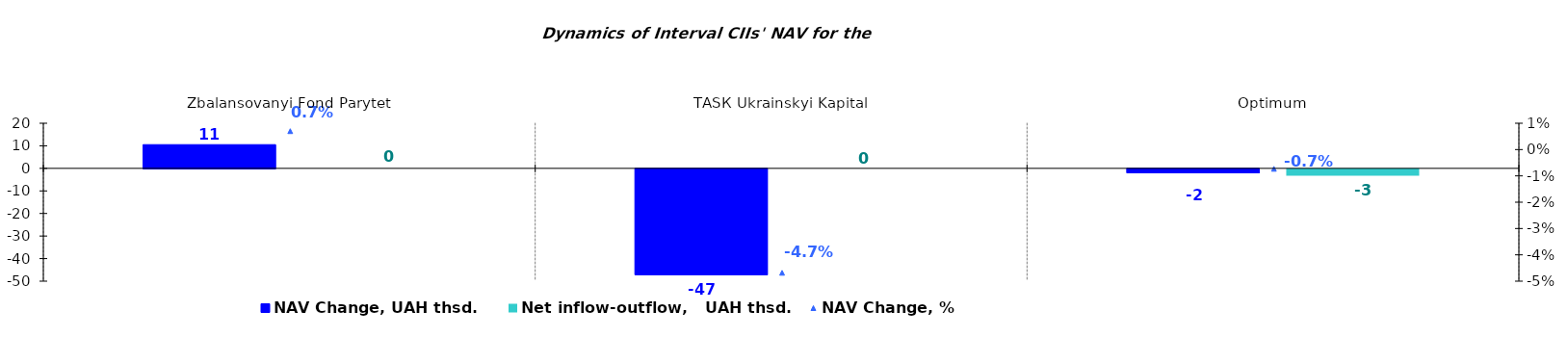
| Category | NAV Change, UAH thsd. | Net inflow-outflow,   UAH thsd. |
|---|---|---|
| Zbalansovanyi Fond Parytet | 10.514 | 0 |
| ТАSК Ukrainskyi Kapital | -46.916 | 0 |
| Оptimum | -1.763 | -2.838 |